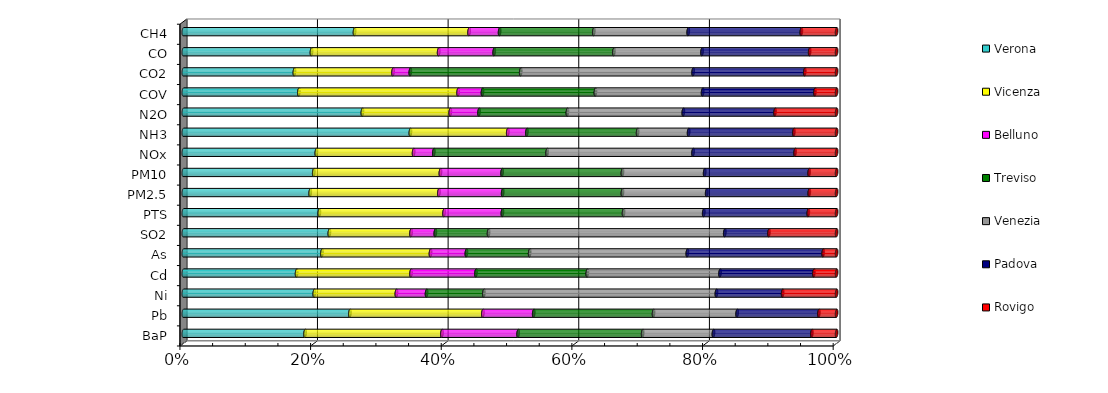
| Category | Verona | Vicenza | Belluno | Treviso | Venezia | Padova | Rovigo |
|---|---|---|---|---|---|---|---|
| CH4 | 37123.538 | 24836.606 | 6621.962 | 20430.318 | 20470.307 | 24525.717 | 7650.835 |
| CO | 22760.318 | 22592.138 | 9861.449 | 21265.592 | 15647.748 | 19121.945 | 4784.321 |
| CO2 | 4749.414 | 4217.781 | 739.095 | 4723.384 | 7371.958 | 4775.43 | 1361.352 |
| COV | 12623.281 | 17410.524 | 2662.517 | 12341.153 | 11717.064 | 12278.976 | 2363.438 |
| N2O | 1357.688 | 666.412 | 217.954 | 670.176 | 878.753 | 695.507 | 466.926 |
| NH3 | 17276.11 | 7407.62 | 1454.02 | 8427.225 | 3879.517 | 8009.649 | 3249.482 |
| NOx | 12703.656 | 9291.469 | 1930.973 | 10824 | 13935.656 | 9748.004 | 3964.693 |
| PM10 | 2735.962 | 2656.902 | 1293.793 | 2524.694 | 1724.573 | 2191.715 | 575.6 |
| PM2.5 | 2287.96 | 2320.454 | 1150.459 | 2159.95 | 1519.476 | 1849.346 | 492.805 |
| PTS | 3273.359 | 3001.52 | 1404.75 | 2916.473 | 1929.975 | 2515.929 | 681.697 |
| SO2 | 1170.105 | 654.553 | 194.725 | 426.791 | 1892.931 | 353.981 | 542.131 |
| As | 85.911 | 67.297 | 22.245 | 39.229 | 97.708 | 84.209 | 8.318 |
| Cd | 85.117 | 85.991 | 48.794 | 83.649 | 99.753 | 70.503 | 17.084 |
| Ni | 223.91 | 140.396 | 51.605 | 98.065 | 397.556 | 113.26 | 92.273 |
| Pb | 1931.696 | 1542.322 | 590.042 | 1389.942 | 969.207 | 948.072 | 205.562 |
| BaP | 470.812 | 529.469 | 294.865 | 481.791 | 273.768 | 380.793 | 95.644 |